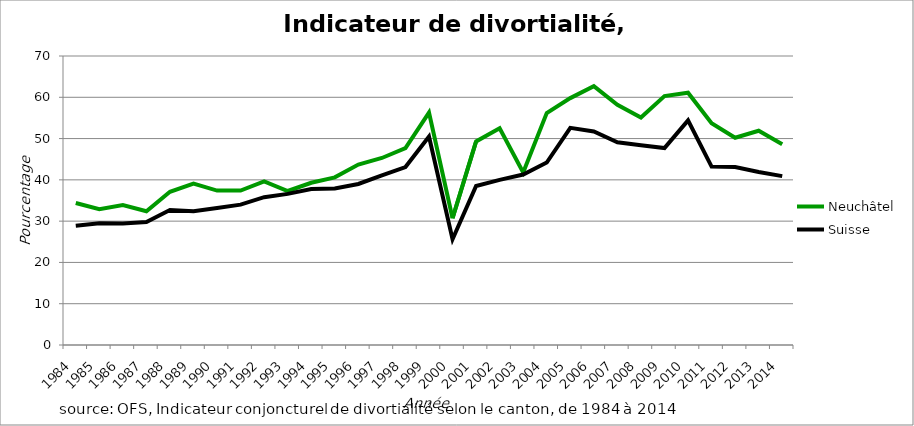
| Category | Neuchâtel | Suisse |
|---|---|---|
| 1984.0 | 34.4 | 28.9 |
| 1985.0 | 32.9 | 29.5 |
| 1986.0 | 33.9 | 29.4 |
| 1987.0 | 32.4 | 29.8 |
| 1988.0 | 37.1 | 32.7 |
| 1989.0 | 39.1 | 32.4 |
| 1990.0 | 37.4 | 33.2 |
| 1991.0 | 37.4 | 34 |
| 1992.0 | 39.6 | 35.8 |
| 1993.0 | 37.3 | 36.6 |
| 1994.0 | 39.3 | 37.8 |
| 1995.0 | 40.6 | 37.9 |
| 1996.0 | 43.7 | 39 |
| 1997.0 | 45.3 | 41.1 |
| 1998.0 | 47.7 | 43.1 |
| 1999.0 | 56.3 | 50.5 |
| 2000.0 | 30.7 | 25.6 |
| 2001.0 | 49.3 | 38.5 |
| 2002.0 | 52.5 | 40 |
| 2003.0 | 41.8 | 41.3 |
| 2004.0 | 56.2 | 44.2 |
| 2005.0 | 59.8 | 52.6 |
| 2006.0 | 62.7 | 51.7 |
| 2007.0 | 58.2 | 49.1 |
| 2008.0 | 55.1 | 48.4 |
| 2009.0 | 60.3 | 47.7 |
| 2010.0 | 61.1 | 54.4 |
| 2011.0 | 53.7 | 43.2 |
| 2012.0 | 50.2 | 43.1 |
| 2013.0 | 51.9 | 41.9 |
| 2014.0 | 48.6 | 40.9 |